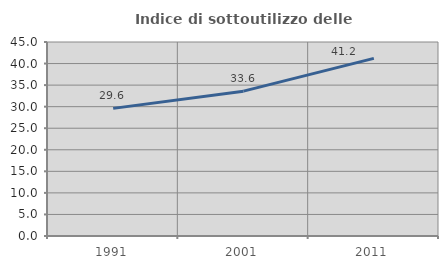
| Category | Indice di sottoutilizzo delle abitazioni  |
|---|---|
| 1991.0 | 29.602 |
| 2001.0 | 33.595 |
| 2011.0 | 41.204 |